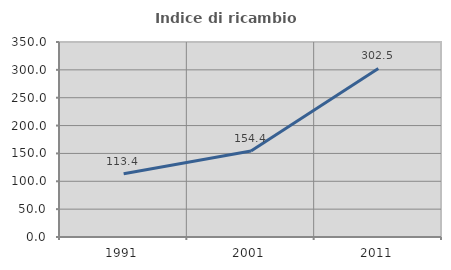
| Category | Indice di ricambio occupazionale  |
|---|---|
| 1991.0 | 113.368 |
| 2001.0 | 154.386 |
| 2011.0 | 302.451 |